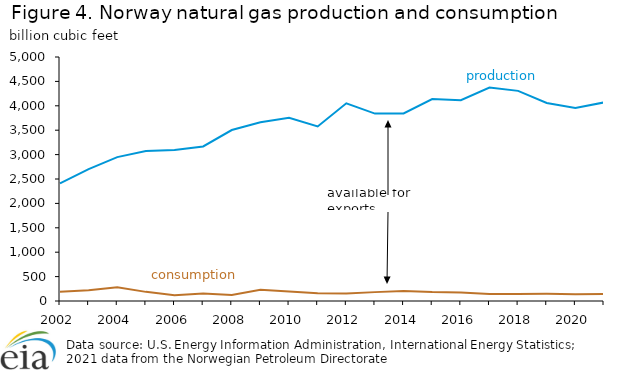
| Category | Production | Consumption |
|---|---|---|
| 2002.0 | 2412.368 | 189.995 |
| 2003.0 | 2703.363 | 222.131 |
| 2004.0 | 2948.449 | 282.167 |
| 2005.0 | 3072.405 | 187.17 |
| 2006.0 | 3093.594 | 119.365 |
| 2007.0 | 3167.756 | 156.092 |
| 2008.0 | 3503.248 | 122.896 |
| 2009.0 | 3663.931 | 230.607 |
| 2010.0 | 3755.75 | 194.444 |
| 2011.0 | 3575.997 | 161.036 |
| 2012.0 | 4051.69 | 153.267 |
| 2013.0 | 3840.506 | 181.872 |
| 2014.0 | 3842.978 | 207.299 |
| 2015.0 | 4138.918 | 184.697 |
| 2016.0 | 4114.904 | 176.54 |
| 2017.0 | 4375.067 | 143.415 |
| 2018.0 | 4306.211 | 145.252 |
| 2019.0 | 4056.864 | 148.398 |
| 2020.0 | 3957.104 | 140.565 |
| 2021.0 | 4068.718 | 144.407 |